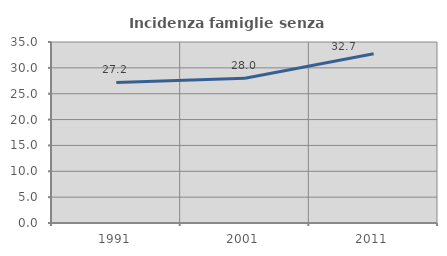
| Category | Incidenza famiglie senza nuclei |
|---|---|
| 1991.0 | 27.175 |
| 2001.0 | 28.007 |
| 2011.0 | 32.723 |